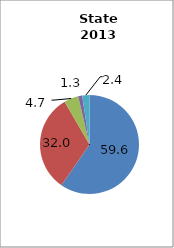
| Category | Arkansas |
|---|---|
| White | 59.604 |
| Black | 32.031 |
| Hispanic | 4.688 |
| Two or More Races | 1.311 |
| All Other1 | 2.366 |